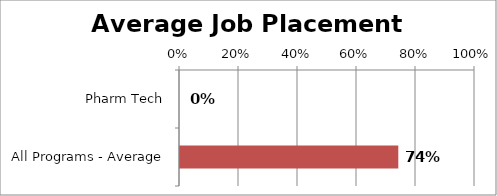
| Category | Series 0 |
|---|---|
| Pharm Tech | 0 |
| All Programs - Average | 0.74 |